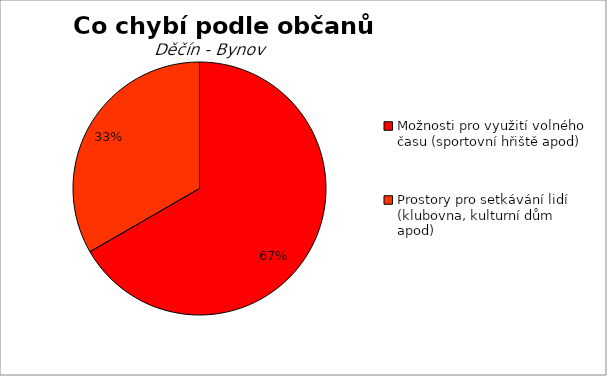
| Category | Series 0 |
|---|---|
| Možnosti pro využití volného času (sportovní hřiště apod) | 2 |
| Prostory pro setkávání lidí (klubovna, kulturní dům apod) | 1 |